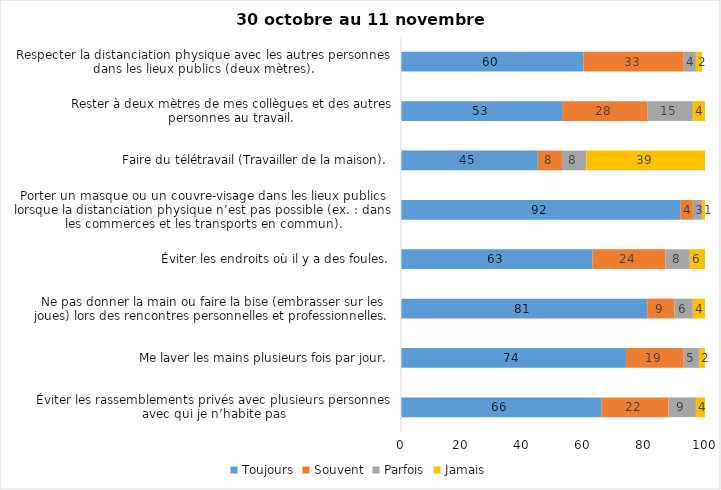
| Category | Toujours | Souvent | Parfois | Jamais |
|---|---|---|---|---|
| Éviter les rassemblements privés avec plusieurs personnes avec qui je n’habite pas | 66 | 22 | 9 | 4 |
| Me laver les mains plusieurs fois par jour. | 74 | 19 | 5 | 2 |
| Ne pas donner la main ou faire la bise (embrasser sur les joues) lors des rencontres personnelles et professionnelles. | 81 | 9 | 6 | 4 |
| Éviter les endroits où il y a des foules. | 63 | 24 | 8 | 6 |
| Porter un masque ou un couvre-visage dans les lieux publics lorsque la distanciation physique n’est pas possible (ex. : dans les commerces et les transports en commun). | 92 | 4 | 3 | 1 |
| Faire du télétravail (Travailler de la maison). | 45 | 8 | 8 | 39 |
| Rester à deux mètres de mes collègues et des autres personnes au travail. | 53 | 28 | 15 | 4 |
| Respecter la distanciation physique avec les autres personnes dans les lieux publics (deux mètres). | 60 | 33 | 4 | 2 |